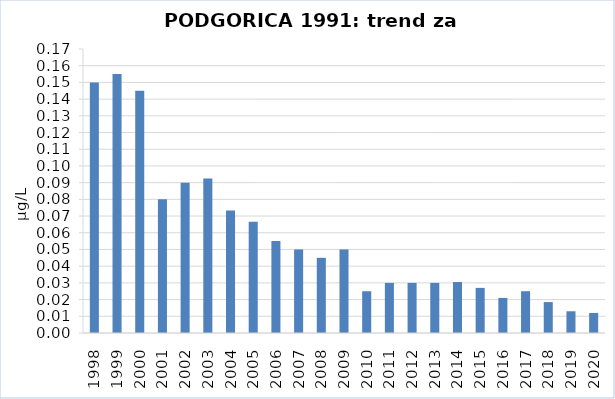
| Category | Vsota |
|---|---|
| 1998 | 0.15 |
| 1999 | 0.155 |
| 2000 | 0.145 |
| 2001 | 0.08 |
| 2002 | 0.09 |
| 2003 | 0.093 |
| 2004 | 0.073 |
| 2005 | 0.067 |
| 2006 | 0.055 |
| 2007 | 0.05 |
| 2008 | 0.045 |
| 2009 | 0.05 |
| 2010 | 0.025 |
| 2011 | 0.03 |
| 2012 | 0.03 |
| 2013 | 0.03 |
| 2014 | 0.03 |
| 2015 | 0.027 |
| 2016 | 0.021 |
| 2017 | 0.025 |
| 2018 | 0.019 |
| 2019 | 0.013 |
| 2020 | 0.012 |